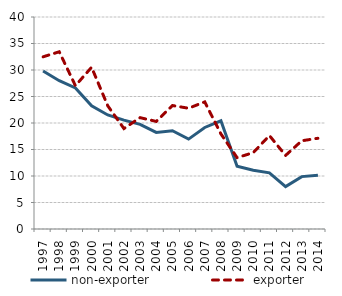
| Category | non-exporter | exporter |
|---|---|---|
| 1997.0 | 29.809 | 32.488 |
| 1998.0 | 27.974 | 33.439 |
| 1999.0 | 26.606 | 27.036 |
| 2000.0 | 23.254 | 30.52 |
| 2001.0 | 21.522 | 23.245 |
| 2002.0 | 20.544 | 18.951 |
| 2003.0 | 19.752 | 21.009 |
| 2004.0 | 18.232 | 20.295 |
| 2005.0 | 18.542 | 23.297 |
| 2006.0 | 16.961 | 22.787 |
| 2007.0 | 19.158 | 23.98 |
| 2008.0 | 20.407 | 17.942 |
| 2009.0 | 11.835 | 13.463 |
| 2010.0 | 11.076 | 14.404 |
| 2011.0 | 10.597 | 17.632 |
| 2012.0 | 7.993 | 13.882 |
| 2013.0 | 9.885 | 16.647 |
| 2014.0 | 10.119 | 17.116 |